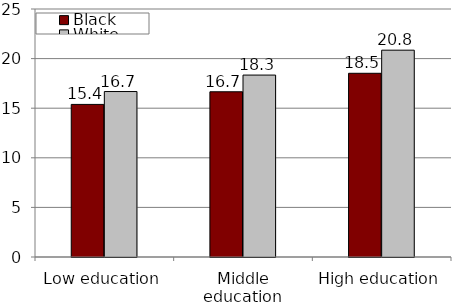
| Category | Black | White |
|---|---|---|
| Low education | 15.381 | 16.68 |
| Middle education | 16.656 | 18.339 |
| High education | 18.52 | 20.848 |